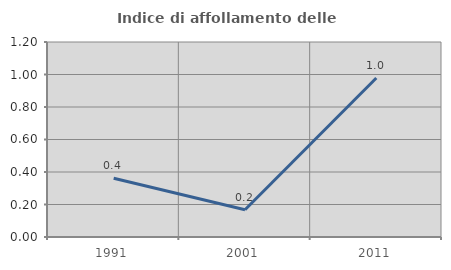
| Category | Indice di affollamento delle abitazioni  |
|---|---|
| 1991.0 | 0.362 |
| 2001.0 | 0.168 |
| 2011.0 | 0.979 |